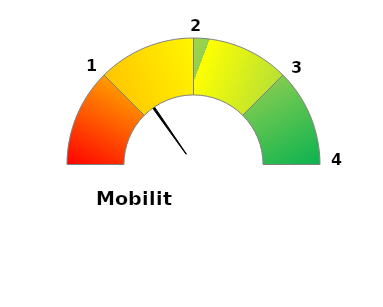
| Category | Variable | Fixe |
|---|---|---|
| 0.0 | 0.3 | 0 |
| 1.0 | 0.01 | 25 |
| 2.0 | 0.69 | 25 |
| 3.0 | 0 | 25 |
| 4.0 | 0 | 25 |
| 5.0 | 1 | 100 |